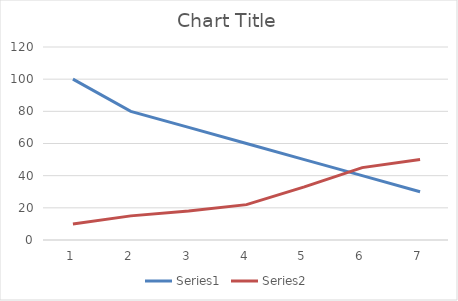
| Category | Series 0 | Series 1 |
|---|---|---|
| 0 | 100 | 10 |
| 1 | 80 | 15 |
| 2 | 70 | 18 |
| 3 | 60 | 22 |
| 4 | 50 | 33 |
| 5 | 40 | 45 |
| 6 | 30 | 50 |